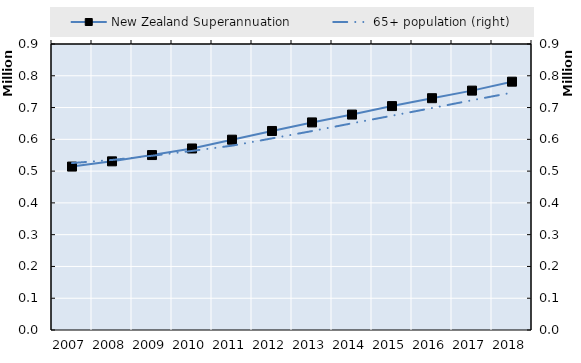
| Category | New Zealand Superannuation | Series 4 | Series 5 | Series 6 | Series 7 | Series 8 | Series 9 | Series 10 | Series 11 | Series 12 | Series 13 | Series 14 | Series 15 | Series 16 | Series 17 | Series 18 | Series 19 |
|---|---|---|---|---|---|---|---|---|---|---|---|---|---|---|---|---|---|
| 2007.0 | 514276 |  |  |  |  |  |  |  |  |  |  |  |  |  |  |  |  |
| 2008.0 | 530758 |  |  |  |  |  |  |  |  |  |  |  |  |  |  |  |  |
| 2009.0 | 550520 |  |  |  |  |  |  |  |  |  |  |  |  |  |  |  |  |
| 2010.0 | 571239 |  |  |  |  |  |  |  |  |  |  |  |  |  |  |  |  |
| 2011.0 | 598933 |  |  |  |  |  |  |  |  |  |  |  |  |  |  |  |  |
| 2012.0 | 626313 |  |  |  |  |  |  |  |  |  |  |  |  |  |  |  |  |
| 2013.0 | 653247 |  |  |  |  |  |  |  |  |  |  |  |  |  |  |  |  |
| 2014.0 | 677935 |  |  |  |  |  |  |  |  |  |  |  |  |  |  |  |  |
| 2015.0 | 704607 |  |  |  |  |  |  |  |  |  |  |  |  |  |  |  |  |
| 2016.0 | 729445 |  |  |  |  |  |  |  |  |  |  |  |  |  |  |  |  |
| 2017.0 | 753319 |  |  |  |  |  |  |  |  |  |  |  |  |  |  |  |  |
| 2018.0 | 781438 |  |  |  |  |  |  |  |  |  |  |  |  |  |  |  |  |